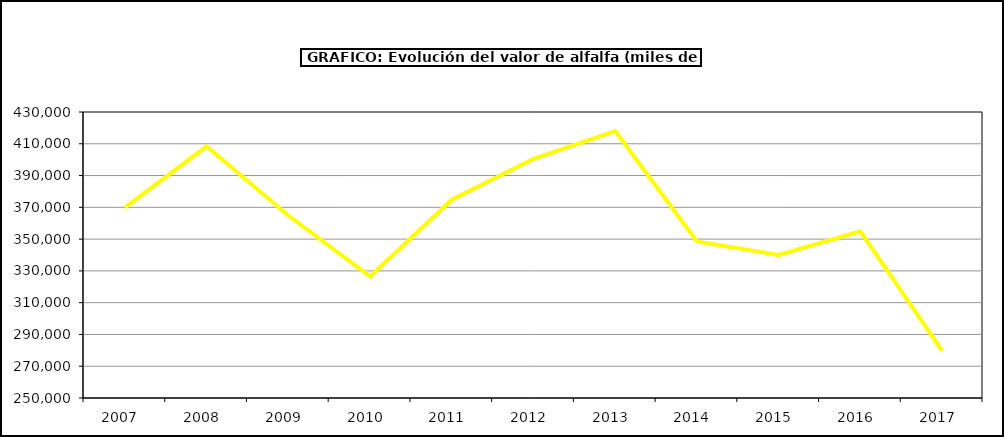
| Category | Valor |
|---|---|
| 2007.0 | 369764.899 |
| 2008.0 | 408419.063 |
| 2009.0 | 364856.04 |
| 2010.0 | 326568.228 |
| 2011.0 | 374822.873 |
| 2012.0 | 400520.754 |
| 2013.0 | 417975.354 |
| 2014.0 | 348510.593 |
| 2015.0 | 340064 |
| 2016.0 | 354947 |
| 2017.0 | 279674.885 |